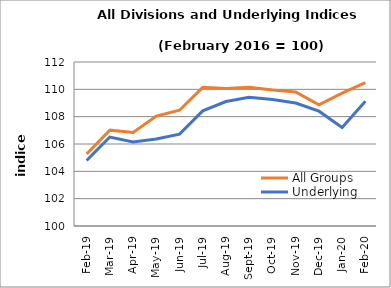
| Category | All Groups | Underlying |
|---|---|---|
| 2019-02-01 | 105.272 | 104.794 |
| 2019-03-01 | 107.012 | 106.51 |
| 2019-04-01 | 106.842 | 106.143 |
| 2019-05-01 | 108.044 | 106.37 |
| 2019-06-01 | 108.473 | 106.721 |
| 2019-07-01 | 110.146 | 108.423 |
| 2019-08-01 | 110.057 | 109.11 |
| 2019-09-01 | 110.148 | 109.423 |
| 2019-10-01 | 109.943 | 109.256 |
| 2019-11-01 | 109.811 | 108.998 |
| 2019-12-01 | 108.864 | 108.4 |
| 2020-01-01 | 109.718 | 107.211 |
| 2020-02-01 | 110.483 | 109.121 |